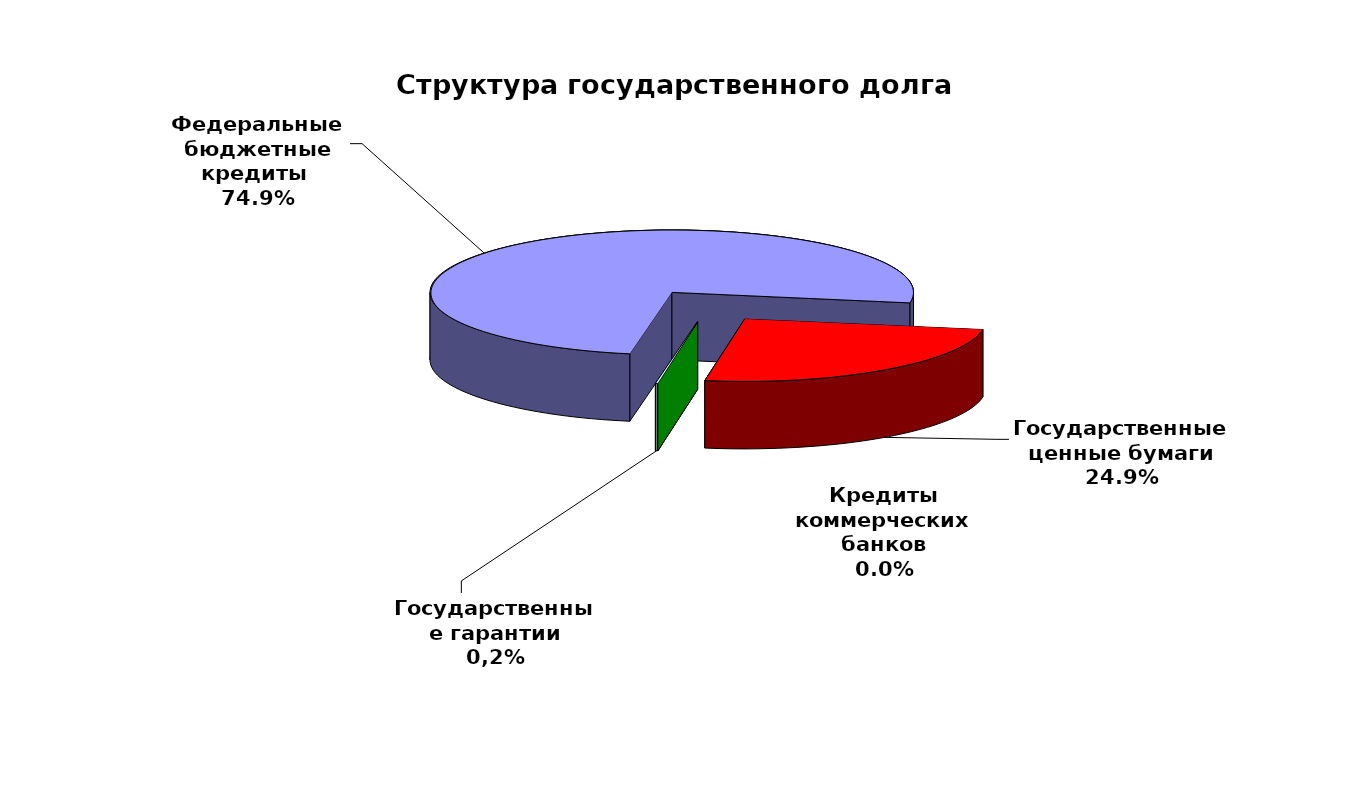
| Category | Series 0 |
|---|---|
| Федеральные бюджетные кредиты  | 102154910.819 |
| Государственные ценные бумаги | 34000000 |
| Кредиты коммерческих банков | 0 |
| Государственные гарантии | 198971.052 |